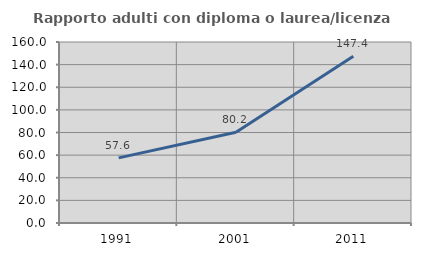
| Category | Rapporto adulti con diploma o laurea/licenza media  |
|---|---|
| 1991.0 | 57.576 |
| 2001.0 | 80.233 |
| 2011.0 | 147.436 |